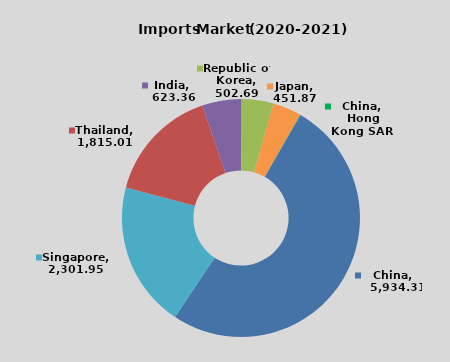
| Category | Series 0 |
|---|---|
| China | 5934.31 |
| Singapore | 2301.95 |
| Thailand | 1815.01 |
| India | 623.36 |
| Republic of  Korea | 502.69 |
| Japan | 451.87 |
| China, Hong Kong SAR | 5.05 |